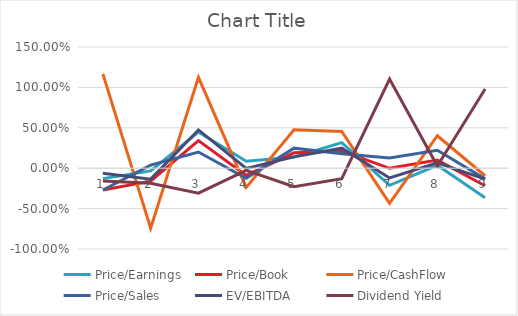
| Category | Price/Earnings | Price/Book | Price/CashFlow | Price/Sales | EV/EBITDA | Dividend Yield |
|---|---|---|---|---|---|---|
| 0 | -0.129 | -0.269 | 1.168 | -0.27 | -0.063 | -0.158 |
| 1 | -0.034 | -0.161 | -0.744 | 0.038 | -0.135 | -0.186 |
| 2 | 0.448 | 0.342 | 1.124 | 0.2 | 0.473 | -0.31 |
| 3 | 0.087 | -0.09 | -0.238 | -0.125 | -0.002 | -0.026 |
| 4 | 0.138 | 0.19 | 0.477 | 0.248 | 0.14 | -0.229 |
| 5 | 0.316 | 0.213 | 0.455 | 0.179 | 0.248 | -0.129 |
| 6 | -0.213 | -0.001 | -0.435 | 0.128 | -0.121 | 1.103 |
| 7 | 0.036 | 0.1 | 0.402 | 0.222 | 0.067 | 0.027 |
| 8 | -0.365 | -0.217 | -0.093 | -0.132 | -0.134 | 0.98 |